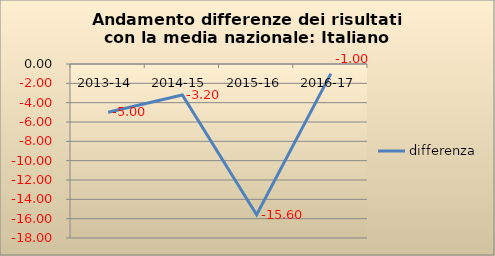
| Category | differenza |
|---|---|
| 2013-14 | -5 |
| 2014-15 | -3.2 |
| 2015-16 | -15.6 |
| 2016-17 | -1 |